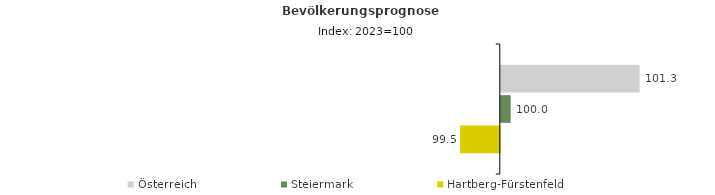
| Category | Österreich | Steiermark | Hartberg-Fürstenfeld |
|---|---|---|---|
| 2023.0 | 101.3 | 100 | 99.5 |